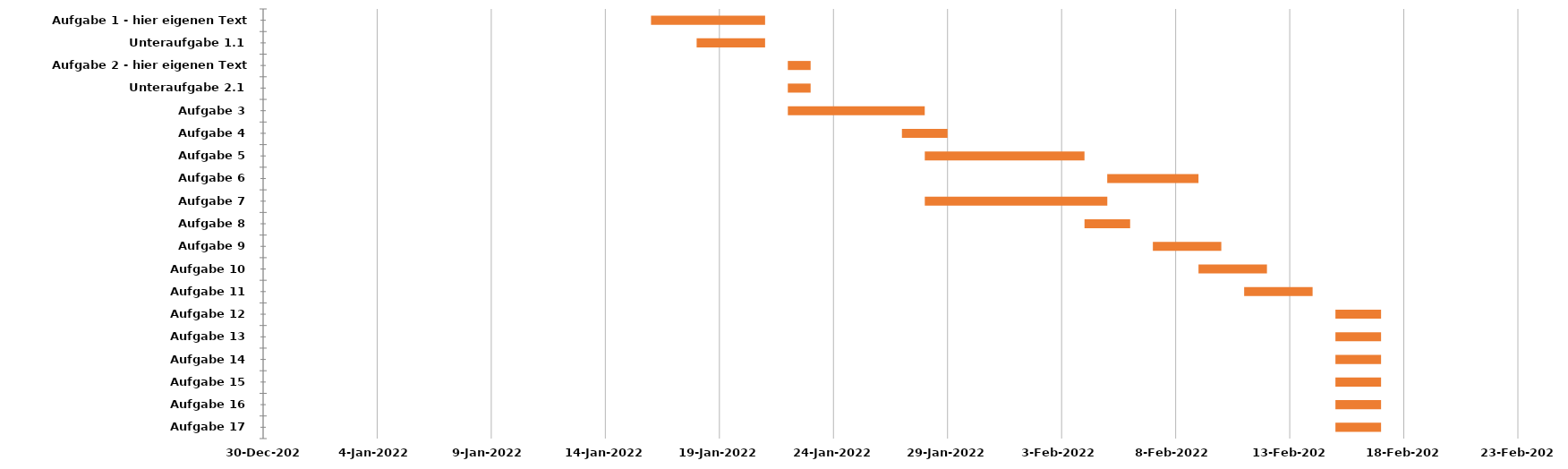
| Category | STARTDATUM | DAUER 
in Tagen |
|---|---|---|
| Aufgabe 1 - hier eigenen Text eingeben | 2022-01-16 | 5 |
| Unteraufgabe 1.1 | 2022-01-18 | 3 |
| Aufgabe 2 - hier eigenen Text eingeben | 2022-01-22 | 1 |
| Unteraufgabe 2.1 | 2022-01-22 | 1 |
| Aufgabe 3 | 2022-01-22 | 6 |
| Aufgabe 4 | 2022-01-27 | 2 |
| Aufgabe 5 | 2022-01-28 | 7 |
| Aufgabe 6 | 2022-02-05 | 4 |
| Aufgabe 7 | 2022-01-28 | 8 |
| Aufgabe 8 | 2022-02-04 | 2 |
| Aufgabe 9 | 2022-02-07 | 3 |
| Aufgabe 10 | 2022-02-09 | 3 |
| Aufgabe 11 | 2022-02-11 | 3 |
| Aufgabe 12 | 2022-02-15 | 2 |
| Aufgabe 13 | 2022-02-15 | 2 |
| Aufgabe 14 | 2022-02-15 | 2 |
| Aufgabe 15 | 2022-02-15 | 2 |
| Aufgabe 16 | 2022-02-15 | 2 |
| Aufgabe 17 | 2022-02-15 | 2 |